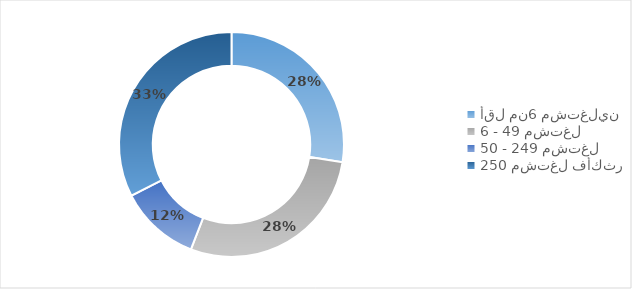
| Category | Series 0 |
|---|---|
| أقل من6 مشتغلين | 15292481 |
| 6 - 49 مشتغل | 15762308 |
| 50 - 249 مشتغل | 6443536 |
| 250 مشتغل فأكثر | 18077713 |